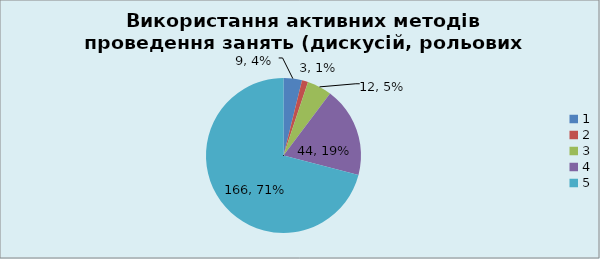
| Category | Кількість | % |
|---|---|---|
| 0 | 9 | 0.038 |
| 1 | 3 | 0.013 |
| 2 | 12 | 0.051 |
| 3 | 44 | 0.188 |
| 4 | 166 | 0.709 |